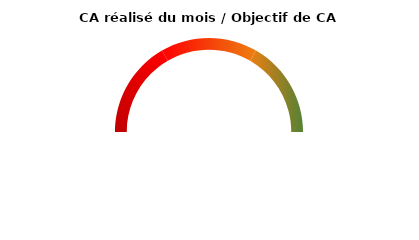
| Category | Valeur | Seuil |
|---|---|---|
| Rouge | 0 | 0.333 |
| Orange | 0 | 0.333 |
| Vert | 1 | 0.333 |